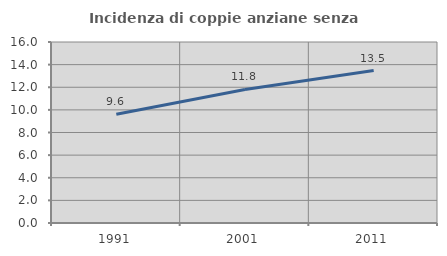
| Category | Incidenza di coppie anziane senza figli  |
|---|---|
| 1991.0 | 9.613 |
| 2001.0 | 11.804 |
| 2011.0 | 13.473 |